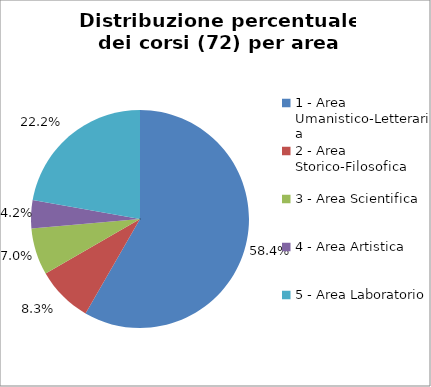
| Category | Nr. Corsi |
|---|---|
| 1 - Area Umanistico-Letteraria | 42 |
| 2 - Area Storico-Filosofica | 6 |
| 3 - Area Scientifica | 5 |
| 4 - Area Artistica | 3 |
| 5 - Area Laboratorio | 16 |